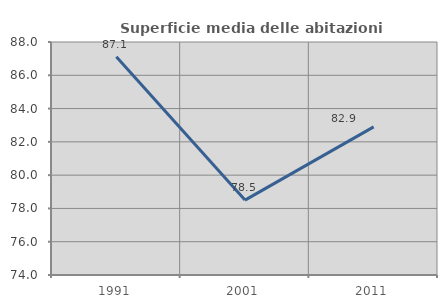
| Category | Superficie media delle abitazioni occupate |
|---|---|
| 1991.0 | 87.112 |
| 2001.0 | 78.501 |
| 2011.0 | 82.897 |